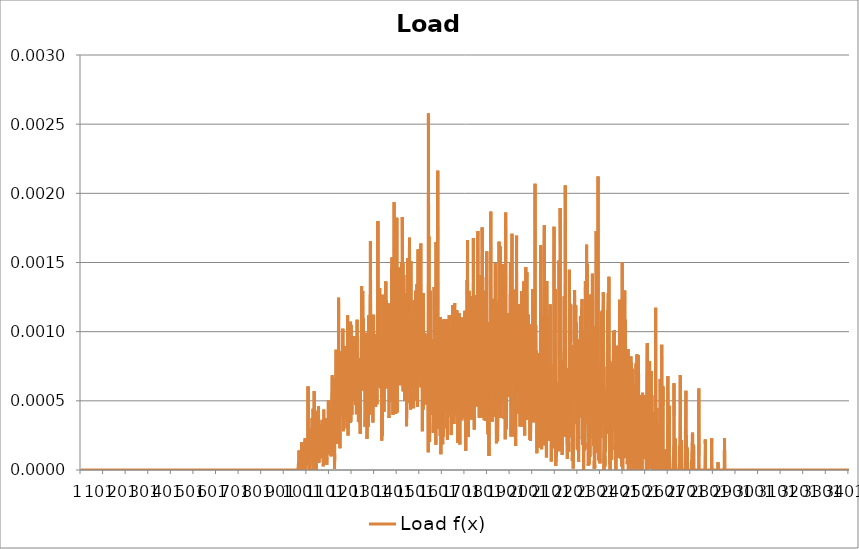
| Category | Load f(x) |
|---|---|
| 0 | 0 |
| 1 | 0 |
| 2 | 0 |
| 3 | 0 |
| 4 | 0 |
| 5 | 0 |
| 6 | 0 |
| 7 | 0 |
| 8 | 0 |
| 9 | 0 |
| 10 | 0 |
| 11 | 0 |
| 12 | 0 |
| 13 | 0 |
| 14 | 0 |
| 15 | 0 |
| 16 | 0 |
| 17 | 0 |
| 18 | 0 |
| 19 | 0 |
| 20 | 0 |
| 21 | 0 |
| 22 | 0 |
| 23 | 0 |
| 24 | 0 |
| 25 | 0 |
| 26 | 0 |
| 27 | 0 |
| 28 | 0 |
| 29 | 0 |
| 30 | 0 |
| 31 | 0 |
| 32 | 0 |
| 33 | 0 |
| 34 | 0 |
| 35 | 0 |
| 36 | 0 |
| 37 | 0 |
| 38 | 0 |
| 39 | 0 |
| 40 | 0 |
| 41 | 0 |
| 42 | 0 |
| 43 | 0 |
| 44 | 0 |
| 45 | 0 |
| 46 | 0 |
| 47 | 0 |
| 48 | 0 |
| 49 | 0 |
| 50 | 0 |
| 51 | 0 |
| 52 | 0 |
| 53 | 0 |
| 54 | 0 |
| 55 | 0 |
| 56 | 0 |
| 57 | 0 |
| 58 | 0 |
| 59 | 0 |
| 60 | 0 |
| 61 | 0 |
| 62 | 0 |
| 63 | 0 |
| 64 | 0 |
| 65 | 0 |
| 66 | 0 |
| 67 | 0 |
| 68 | 0 |
| 69 | 0 |
| 70 | 0 |
| 71 | 0 |
| 72 | 0 |
| 73 | 0 |
| 74 | 0 |
| 75 | 0 |
| 76 | 0 |
| 77 | 0 |
| 78 | 0 |
| 79 | 0 |
| 80 | 0 |
| 81 | 0 |
| 82 | 0 |
| 83 | 0 |
| 84 | 0 |
| 85 | 0 |
| 86 | 0 |
| 87 | 0 |
| 88 | 0 |
| 89 | 0 |
| 90 | 0 |
| 91 | 0 |
| 92 | 0 |
| 93 | 0 |
| 94 | 0 |
| 95 | 0 |
| 96 | 0 |
| 97 | 0 |
| 98 | 0 |
| 99 | 0 |
| 100 | 0 |
| 101 | 0 |
| 102 | 0 |
| 103 | 0 |
| 104 | 0 |
| 105 | 0 |
| 106 | 0 |
| 107 | 0 |
| 108 | 0 |
| 109 | 0 |
| 110 | 0 |
| 111 | 0 |
| 112 | 0 |
| 113 | 0 |
| 114 | 0 |
| 115 | 0 |
| 116 | 0 |
| 117 | 0 |
| 118 | 0 |
| 119 | 0 |
| 120 | 0 |
| 121 | 0 |
| 122 | 0 |
| 123 | 0 |
| 124 | 0 |
| 125 | 0 |
| 126 | 0 |
| 127 | 0 |
| 128 | 0 |
| 129 | 0 |
| 130 | 0 |
| 131 | 0 |
| 132 | 0 |
| 133 | 0 |
| 134 | 0 |
| 135 | 0 |
| 136 | 0 |
| 137 | 0 |
| 138 | 0 |
| 139 | 0 |
| 140 | 0 |
| 141 | 0 |
| 142 | 0 |
| 143 | 0 |
| 144 | 0 |
| 145 | 0 |
| 146 | 0 |
| 147 | 0 |
| 148 | 0 |
| 149 | 0 |
| 150 | 0 |
| 151 | 0 |
| 152 | 0 |
| 153 | 0 |
| 154 | 0 |
| 155 | 0 |
| 156 | 0 |
| 157 | 0 |
| 158 | 0 |
| 159 | 0 |
| 160 | 0 |
| 161 | 0 |
| 162 | 0 |
| 163 | 0 |
| 164 | 0 |
| 165 | 0 |
| 166 | 0 |
| 167 | 0 |
| 168 | 0 |
| 169 | 0 |
| 170 | 0 |
| 171 | 0 |
| 172 | 0 |
| 173 | 0 |
| 174 | 0 |
| 175 | 0 |
| 176 | 0 |
| 177 | 0 |
| 178 | 0 |
| 179 | 0 |
| 180 | 0 |
| 181 | 0 |
| 182 | 0 |
| 183 | 0 |
| 184 | 0 |
| 185 | 0 |
| 186 | 0 |
| 187 | 0 |
| 188 | 0 |
| 189 | 0 |
| 190 | 0 |
| 191 | 0 |
| 192 | 0 |
| 193 | 0 |
| 194 | 0 |
| 195 | 0 |
| 196 | 0 |
| 197 | 0 |
| 198 | 0 |
| 199 | 0 |
| 200 | 0 |
| 201 | 0 |
| 202 | 0 |
| 203 | 0 |
| 204 | 0 |
| 205 | 0 |
| 206 | 0 |
| 207 | 0 |
| 208 | 0 |
| 209 | 0 |
| 210 | 0 |
| 211 | 0 |
| 212 | 0 |
| 213 | 0 |
| 214 | 0 |
| 215 | 0 |
| 216 | 0 |
| 217 | 0 |
| 218 | 0 |
| 219 | 0 |
| 220 | 0 |
| 221 | 0 |
| 222 | 0 |
| 223 | 0 |
| 224 | 0 |
| 225 | 0 |
| 226 | 0 |
| 227 | 0 |
| 228 | 0 |
| 229 | 0 |
| 230 | 0 |
| 231 | 0 |
| 232 | 0 |
| 233 | 0 |
| 234 | 0 |
| 235 | 0 |
| 236 | 0 |
| 237 | 0 |
| 238 | 0 |
| 239 | 0 |
| 240 | 0 |
| 241 | 0 |
| 242 | 0 |
| 243 | 0 |
| 244 | 0 |
| 245 | 0 |
| 246 | 0 |
| 247 | 0 |
| 248 | 0 |
| 249 | 0 |
| 250 | 0 |
| 251 | 0 |
| 252 | 0 |
| 253 | 0 |
| 254 | 0 |
| 255 | 0 |
| 256 | 0 |
| 257 | 0 |
| 258 | 0 |
| 259 | 0 |
| 260 | 0 |
| 261 | 0 |
| 262 | 0 |
| 263 | 0 |
| 264 | 0 |
| 265 | 0 |
| 266 | 0 |
| 267 | 0 |
| 268 | 0 |
| 269 | 0 |
| 270 | 0 |
| 271 | 0 |
| 272 | 0 |
| 273 | 0 |
| 274 | 0 |
| 275 | 0 |
| 276 | 0 |
| 277 | 0 |
| 278 | 0 |
| 279 | 0 |
| 280 | 0 |
| 281 | 0 |
| 282 | 0 |
| 283 | 0 |
| 284 | 0 |
| 285 | 0 |
| 286 | 0 |
| 287 | 0 |
| 288 | 0 |
| 289 | 0 |
| 290 | 0 |
| 291 | 0 |
| 292 | 0 |
| 293 | 0 |
| 294 | 0 |
| 295 | 0 |
| 296 | 0 |
| 297 | 0 |
| 298 | 0 |
| 299 | 0 |
| 300 | 0 |
| 301 | 0 |
| 302 | 0 |
| 303 | 0 |
| 304 | 0 |
| 305 | 0 |
| 306 | 0 |
| 307 | 0 |
| 308 | 0 |
| 309 | 0 |
| 310 | 0 |
| 311 | 0 |
| 312 | 0 |
| 313 | 0 |
| 314 | 0 |
| 315 | 0 |
| 316 | 0 |
| 317 | 0 |
| 318 | 0 |
| 319 | 0 |
| 320 | 0 |
| 321 | 0 |
| 322 | 0 |
| 323 | 0 |
| 324 | 0 |
| 325 | 0 |
| 326 | 0 |
| 327 | 0 |
| 328 | 0 |
| 329 | 0 |
| 330 | 0 |
| 331 | 0 |
| 332 | 0 |
| 333 | 0 |
| 334 | 0 |
| 335 | 0 |
| 336 | 0 |
| 337 | 0 |
| 338 | 0 |
| 339 | 0 |
| 340 | 0 |
| 341 | 0 |
| 342 | 0 |
| 343 | 0 |
| 344 | 0 |
| 345 | 0 |
| 346 | 0 |
| 347 | 0 |
| 348 | 0 |
| 349 | 0 |
| 350 | 0 |
| 351 | 0 |
| 352 | 0 |
| 353 | 0 |
| 354 | 0 |
| 355 | 0 |
| 356 | 0 |
| 357 | 0 |
| 358 | 0 |
| 359 | 0 |
| 360 | 0 |
| 361 | 0 |
| 362 | 0 |
| 363 | 0 |
| 364 | 0 |
| 365 | 0 |
| 366 | 0 |
| 367 | 0 |
| 368 | 0 |
| 369 | 0 |
| 370 | 0 |
| 371 | 0 |
| 372 | 0 |
| 373 | 0 |
| 374 | 0 |
| 375 | 0 |
| 376 | 0 |
| 377 | 0 |
| 378 | 0 |
| 379 | 0 |
| 380 | 0 |
| 381 | 0 |
| 382 | 0 |
| 383 | 0 |
| 384 | 0 |
| 385 | 0 |
| 386 | 0 |
| 387 | 0 |
| 388 | 0 |
| 389 | 0 |
| 390 | 0 |
| 391 | 0 |
| 392 | 0 |
| 393 | 0 |
| 394 | 0 |
| 395 | 0 |
| 396 | 0 |
| 397 | 0 |
| 398 | 0 |
| 399 | 0 |
| 400 | 0 |
| 401 | 0 |
| 402 | 0 |
| 403 | 0 |
| 404 | 0 |
| 405 | 0 |
| 406 | 0 |
| 407 | 0 |
| 408 | 0 |
| 409 | 0 |
| 410 | 0 |
| 411 | 0 |
| 412 | 0 |
| 413 | 0 |
| 414 | 0 |
| 415 | 0 |
| 416 | 0 |
| 417 | 0 |
| 418 | 0 |
| 419 | 0 |
| 420 | 0 |
| 421 | 0 |
| 422 | 0 |
| 423 | 0 |
| 424 | 0 |
| 425 | 0 |
| 426 | 0 |
| 427 | 0 |
| 428 | 0 |
| 429 | 0 |
| 430 | 0 |
| 431 | 0 |
| 432 | 0 |
| 433 | 0 |
| 434 | 0 |
| 435 | 0 |
| 436 | 0 |
| 437 | 0 |
| 438 | 0 |
| 439 | 0 |
| 440 | 0 |
| 441 | 0 |
| 442 | 0 |
| 443 | 0 |
| 444 | 0 |
| 445 | 0 |
| 446 | 0 |
| 447 | 0 |
| 448 | 0 |
| 449 | 0 |
| 450 | 0 |
| 451 | 0 |
| 452 | 0 |
| 453 | 0 |
| 454 | 0 |
| 455 | 0 |
| 456 | 0 |
| 457 | 0 |
| 458 | 0 |
| 459 | 0 |
| 460 | 0 |
| 461 | 0 |
| 462 | 0 |
| 463 | 0 |
| 464 | 0 |
| 465 | 0 |
| 466 | 0 |
| 467 | 0 |
| 468 | 0 |
| 469 | 0 |
| 470 | 0 |
| 471 | 0 |
| 472 | 0 |
| 473 | 0 |
| 474 | 0 |
| 475 | 0 |
| 476 | 0 |
| 477 | 0 |
| 478 | 0 |
| 479 | 0 |
| 480 | 0 |
| 481 | 0 |
| 482 | 0 |
| 483 | 0 |
| 484 | 0 |
| 485 | 0 |
| 486 | 0 |
| 487 | 0 |
| 488 | 0 |
| 489 | 0 |
| 490 | 0 |
| 491 | 0 |
| 492 | 0 |
| 493 | 0 |
| 494 | 0 |
| 495 | 0 |
| 496 | 0 |
| 497 | 0 |
| 498 | 0 |
| 499 | 0 |
| 500 | 0 |
| 501 | 0 |
| 502 | 0 |
| 503 | 0 |
| 504 | 0 |
| 505 | 0 |
| 506 | 0 |
| 507 | 0 |
| 508 | 0 |
| 509 | 0 |
| 510 | 0 |
| 511 | 0 |
| 512 | 0 |
| 513 | 0 |
| 514 | 0 |
| 515 | 0 |
| 516 | 0 |
| 517 | 0 |
| 518 | 0 |
| 519 | 0 |
| 520 | 0 |
| 521 | 0 |
| 522 | 0 |
| 523 | 0 |
| 524 | 0 |
| 525 | 0 |
| 526 | 0 |
| 527 | 0 |
| 528 | 0 |
| 529 | 0 |
| 530 | 0 |
| 531 | 0 |
| 532 | 0 |
| 533 | 0 |
| 534 | 0 |
| 535 | 0 |
| 536 | 0 |
| 537 | 0 |
| 538 | 0 |
| 539 | 0 |
| 540 | 0 |
| 541 | 0 |
| 542 | 0 |
| 543 | 0 |
| 544 | 0 |
| 545 | 0 |
| 546 | 0 |
| 547 | 0 |
| 548 | 0 |
| 549 | 0 |
| 550 | 0 |
| 551 | 0 |
| 552 | 0 |
| 553 | 0 |
| 554 | 0 |
| 555 | 0 |
| 556 | 0 |
| 557 | 0 |
| 558 | 0 |
| 559 | 0 |
| 560 | 0 |
| 561 | 0 |
| 562 | 0 |
| 563 | 0 |
| 564 | 0 |
| 565 | 0 |
| 566 | 0 |
| 567 | 0 |
| 568 | 0 |
| 569 | 0 |
| 570 | 0 |
| 571 | 0 |
| 572 | 0 |
| 573 | 0 |
| 574 | 0 |
| 575 | 0 |
| 576 | 0 |
| 577 | 0 |
| 578 | 0 |
| 579 | 0 |
| 580 | 0 |
| 581 | 0 |
| 582 | 0 |
| 583 | 0 |
| 584 | 0 |
| 585 | 0 |
| 586 | 0 |
| 587 | 0 |
| 588 | 0 |
| 589 | 0 |
| 590 | 0 |
| 591 | 0 |
| 592 | 0 |
| 593 | 0 |
| 594 | 0 |
| 595 | 0 |
| 596 | 0 |
| 597 | 0 |
| 598 | 0 |
| 599 | 0 |
| 600 | 0 |
| 601 | 0 |
| 602 | 0 |
| 603 | 0 |
| 604 | 0 |
| 605 | 0 |
| 606 | 0 |
| 607 | 0 |
| 608 | 0 |
| 609 | 0 |
| 610 | 0 |
| 611 | 0 |
| 612 | 0 |
| 613 | 0 |
| 614 | 0 |
| 615 | 0 |
| 616 | 0 |
| 617 | 0 |
| 618 | 0 |
| 619 | 0 |
| 620 | 0 |
| 621 | 0 |
| 622 | 0 |
| 623 | 0 |
| 624 | 0 |
| 625 | 0 |
| 626 | 0 |
| 627 | 0 |
| 628 | 0 |
| 629 | 0 |
| 630 | 0 |
| 631 | 0 |
| 632 | 0 |
| 633 | 0 |
| 634 | 0 |
| 635 | 0 |
| 636 | 0 |
| 637 | 0 |
| 638 | 0 |
| 639 | 0 |
| 640 | 0 |
| 641 | 0 |
| 642 | 0 |
| 643 | 0 |
| 644 | 0 |
| 645 | 0 |
| 646 | 0 |
| 647 | 0 |
| 648 | 0 |
| 649 | 0 |
| 650 | 0 |
| 651 | 0 |
| 652 | 0 |
| 653 | 0 |
| 654 | 0 |
| 655 | 0 |
| 656 | 0 |
| 657 | 0 |
| 658 | 0 |
| 659 | 0 |
| 660 | 0 |
| 661 | 0 |
| 662 | 0 |
| 663 | 0 |
| 664 | 0 |
| 665 | 0 |
| 666 | 0 |
| 667 | 0 |
| 668 | 0 |
| 669 | 0 |
| 670 | 0 |
| 671 | 0 |
| 672 | 0 |
| 673 | 0 |
| 674 | 0 |
| 675 | 0 |
| 676 | 0 |
| 677 | 0 |
| 678 | 0 |
| 679 | 0 |
| 680 | 0 |
| 681 | 0 |
| 682 | 0 |
| 683 | 0 |
| 684 | 0 |
| 685 | 0 |
| 686 | 0 |
| 687 | 0 |
| 688 | 0 |
| 689 | 0 |
| 690 | 0 |
| 691 | 0 |
| 692 | 0 |
| 693 | 0 |
| 694 | 0 |
| 695 | 0 |
| 696 | 0 |
| 697 | 0 |
| 698 | 0 |
| 699 | 0 |
| 700 | 0 |
| 701 | 0 |
| 702 | 0 |
| 703 | 0 |
| 704 | 0 |
| 705 | 0 |
| 706 | 0 |
| 707 | 0 |
| 708 | 0 |
| 709 | 0 |
| 710 | 0 |
| 711 | 0 |
| 712 | 0 |
| 713 | 0 |
| 714 | 0 |
| 715 | 0 |
| 716 | 0 |
| 717 | 0 |
| 718 | 0 |
| 719 | 0 |
| 720 | 0 |
| 721 | 0 |
| 722 | 0 |
| 723 | 0 |
| 724 | 0 |
| 725 | 0 |
| 726 | 0 |
| 727 | 0 |
| 728 | 0 |
| 729 | 0 |
| 730 | 0 |
| 731 | 0 |
| 732 | 0 |
| 733 | 0 |
| 734 | 0 |
| 735 | 0 |
| 736 | 0 |
| 737 | 0 |
| 738 | 0 |
| 739 | 0 |
| 740 | 0 |
| 741 | 0 |
| 742 | 0 |
| 743 | 0 |
| 744 | 0 |
| 745 | 0 |
| 746 | 0 |
| 747 | 0 |
| 748 | 0 |
| 749 | 0 |
| 750 | 0 |
| 751 | 0 |
| 752 | 0 |
| 753 | 0 |
| 754 | 0 |
| 755 | 0 |
| 756 | 0 |
| 757 | 0 |
| 758 | 0 |
| 759 | 0 |
| 760 | 0 |
| 761 | 0 |
| 762 | 0 |
| 763 | 0 |
| 764 | 0 |
| 765 | 0 |
| 766 | 0 |
| 767 | 0 |
| 768 | 0 |
| 769 | 0 |
| 770 | 0 |
| 771 | 0 |
| 772 | 0 |
| 773 | 0 |
| 774 | 0 |
| 775 | 0 |
| 776 | 0 |
| 777 | 0 |
| 778 | 0 |
| 779 | 0 |
| 780 | 0 |
| 781 | 0 |
| 782 | 0 |
| 783 | 0 |
| 784 | 0 |
| 785 | 0 |
| 786 | 0 |
| 787 | 0 |
| 788 | 0 |
| 789 | 0 |
| 790 | 0 |
| 791 | 0 |
| 792 | 0 |
| 793 | 0 |
| 794 | 0 |
| 795 | 0 |
| 796 | 0 |
| 797 | 0 |
| 798 | 0 |
| 799 | 0 |
| 800 | 0 |
| 801 | 0 |
| 802 | 0 |
| 803 | 0 |
| 804 | 0 |
| 805 | 0 |
| 806 | 0 |
| 807 | 0 |
| 808 | 0 |
| 809 | 0 |
| 810 | 0 |
| 811 | 0 |
| 812 | 0 |
| 813 | 0 |
| 814 | 0 |
| 815 | 0 |
| 816 | 0 |
| 817 | 0 |
| 818 | 0 |
| 819 | 0 |
| 820 | 0 |
| 821 | 0 |
| 822 | 0 |
| 823 | 0 |
| 824 | 0 |
| 825 | 0 |
| 826 | 0 |
| 827 | 0 |
| 828 | 0 |
| 829 | 0 |
| 830 | 0 |
| 831 | 0 |
| 832 | 0 |
| 833 | 0 |
| 834 | 0 |
| 835 | 0 |
| 836 | 0 |
| 837 | 0 |
| 838 | 0 |
| 839 | 0 |
| 840 | 0 |
| 841 | 0 |
| 842 | 0 |
| 843 | 0 |
| 844 | 0 |
| 845 | 0 |
| 846 | 0 |
| 847 | 0 |
| 848 | 0 |
| 849 | 0 |
| 850 | 0 |
| 851 | 0 |
| 852 | 0 |
| 853 | 0 |
| 854 | 0 |
| 855 | 0 |
| 856 | 0 |
| 857 | 0 |
| 858 | 0 |
| 859 | 0 |
| 860 | 0 |
| 861 | 0 |
| 862 | 0 |
| 863 | 0 |
| 864 | 0 |
| 865 | 0 |
| 866 | 0 |
| 867 | 0 |
| 868 | 0 |
| 869 | 0 |
| 870 | 0 |
| 871 | 0 |
| 872 | 0 |
| 873 | 0 |
| 874 | 0 |
| 875 | 0 |
| 876 | 0 |
| 877 | 0 |
| 878 | 0 |
| 879 | 0 |
| 880 | 0 |
| 881 | 0 |
| 882 | 0 |
| 883 | 0 |
| 884 | 0 |
| 885 | 0 |
| 886 | 0 |
| 887 | 0 |
| 888 | 0 |
| 889 | 0 |
| 890 | 0 |
| 891 | 0 |
| 892 | 0 |
| 893 | 0 |
| 894 | 0 |
| 895 | 0 |
| 896 | 0 |
| 897 | 0 |
| 898 | 0 |
| 899 | 0 |
| 900 | 0 |
| 901 | 0 |
| 902 | 0 |
| 903 | 0 |
| 904 | 0 |
| 905 | 0 |
| 906 | 0 |
| 907 | 0 |
| 908 | 0 |
| 909 | 0 |
| 910 | 0 |
| 911 | 0 |
| 912 | 0 |
| 913 | 0 |
| 914 | 0 |
| 915 | 0 |
| 916 | 0 |
| 917 | 0 |
| 918 | 0 |
| 919 | 0 |
| 920 | 0 |
| 921 | 0 |
| 922 | 0 |
| 923 | 0 |
| 924 | 0 |
| 925 | 0 |
| 926 | 0 |
| 927 | 0 |
| 928 | 0 |
| 929 | 0 |
| 930 | 0 |
| 931 | 0 |
| 932 | 0 |
| 933 | 0 |
| 934 | 0 |
| 935 | 0 |
| 936 | 0 |
| 937 | 0 |
| 938 | 0 |
| 939 | 0 |
| 940 | 0 |
| 941 | 0 |
| 942 | 0 |
| 943 | 0 |
| 944 | 0 |
| 945 | 0 |
| 946 | 0 |
| 947 | 0 |
| 948 | 0 |
| 949 | 0 |
| 950 | 0 |
| 951 | 0 |
| 952 | 0 |
| 953 | 0 |
| 954 | 0 |
| 955 | 0 |
| 956 | 0 |
| 957 | 0 |
| 958 | 0 |
| 959 | 0 |
| 960 | 0 |
| 961 | 0 |
| 962 | 0 |
| 963 | 0 |
| 964 | 0 |
| 965 | 0 |
| 966 | 0 |
| 967 | 0 |
| 968 | 0 |
| 969 | 0 |
| 970 | 0 |
| 971 | 0 |
| 972 | 0 |
| 973 | 0 |
| 974 | 0 |
| 975 | 0 |
| 976 | 0 |
| 977 | 0 |
| 978 | 0 |
| 979 | 0 |
| 980 | 0 |
| 981 | 0 |
| 982 | 0 |
| 983 | 0 |
| 984 | 0 |
| 985 | 0 |
| 986 | 0 |
| 987 | 0 |
| 988 | 0 |
| 989 | 0 |
| 990 | 0 |
| 991 | 0 |
| 992 | 0 |
| 993 | 0 |
| 994 | 0 |
| 995 | 0 |
| 996 | 0 |
| 997 | 0 |
| 998 | 0 |
| 999 | 0 |
| 1000 | 0 |
| 1001 | 0 |
| 1002 | 0 |
| 1003 | 0 |
| 1004 | 0 |
| 1005 | 0.001 |
| 1006 | 0 |
| 1007 | 0 |
| 1008 | 0 |
| 1009 | 0 |
| 1010 | 0 |
| 1011 | 0 |
| 1012 | 0 |
| 1013 | 0 |
| 1014 | 0 |
| 1015 | 0 |
| 1016 | 0 |
| 1017 | 0 |
| 1018 | 0 |
| 1019 | 0 |
| 1020 | 0 |
| 1021 | 0 |
| 1022 | 0 |
| 1023 | 0 |
| 1024 | 0 |
| 1025 | 0 |
| 1026 | 0 |
| 1027 | 0 |
| 1028 | 0 |
| 1029 | 0 |
| 1030 | 0 |
| 1031 | 0 |
| 1032 | 0.001 |
| 1033 | 0 |
| 1034 | 0 |
| 1035 | 0 |
| 1036 | 0 |
| 1037 | 0 |
| 1038 | 0 |
| 1039 | 0 |
| 1040 | 0 |
| 1041 | 0 |
| 1042 | 0 |
| 1043 | 0 |
| 1044 | 0 |
| 1045 | 0 |
| 1046 | 0 |
| 1047 | 0 |
| 1048 | 0 |
| 1049 | 0 |
| 1050 | 0 |
| 1051 | 0 |
| 1052 | 0 |
| 1053 | 0 |
| 1054 | 0 |
| 1055 | 0 |
| 1056 | 0 |
| 1057 | 0 |
| 1058 | 0 |
| 1059 | 0 |
| 1060 | 0 |
| 1061 | 0 |
| 1062 | 0 |
| 1063 | 0 |
| 1064 | 0 |
| 1065 | 0 |
| 1066 | 0 |
| 1067 | 0 |
| 1068 | 0 |
| 1069 | 0 |
| 1070 | 0 |
| 1071 | 0 |
| 1072 | 0 |
| 1073 | 0 |
| 1074 | 0 |
| 1075 | 0 |
| 1076 | 0 |
| 1077 | 0 |
| 1078 | 0 |
| 1079 | 0 |
| 1080 | 0 |
| 1081 | 0 |
| 1082 | 0 |
| 1083 | 0 |
| 1084 | 0 |
| 1085 | 0 |
| 1086 | 0 |
| 1087 | 0 |
| 1088 | 0 |
| 1089 | 0 |
| 1090 | 0 |
| 1091 | 0 |
| 1092 | 0 |
| 1093 | 0 |
| 1094 | 0 |
| 1095 | 0.001 |
| 1096 | 0 |
| 1097 | 0 |
| 1098 | 0 |
| 1099 | 0 |
| 1100 | 0 |
| 1101 | 0 |
| 1102 | 0 |
| 1103 | 0 |
| 1104 | 0 |
| 1105 | 0 |
| 1106 | 0 |
| 1107 | 0 |
| 1108 | 0 |
| 1109 | 0 |
| 1110 | 0.001 |
| 1111 | 0.001 |
| 1112 | 0.001 |
| 1113 | 0 |
| 1114 | 0 |
| 1115 | 0 |
| 1116 | 0 |
| 1117 | 0 |
| 1118 | 0 |
| 1119 | 0 |
| 1120 | 0 |
| 1121 | 0 |
| 1122 | 0 |
| 1123 | 0 |
| 1124 | 0.001 |
| 1125 | 0 |
| 1126 | 0 |
| 1127 | 0.001 |
| 1128 | 0.001 |
| 1129 | 0.001 |
| 1130 | 0 |
| 1131 | 0 |
| 1132 | 0.001 |
| 1133 | 0 |
| 1134 | 0 |
| 1135 | 0 |
| 1136 | 0.001 |
| 1137 | 0 |
| 1138 | 0 |
| 1139 | 0 |
| 1140 | 0.001 |
| 1141 | 0.001 |
| 1142 | 0 |
| 1143 | 0.001 |
| 1144 | 0.001 |
| 1145 | 0 |
| 1146 | 0 |
| 1147 | 0 |
| 1148 | 0.001 |
| 1149 | 0.001 |
| 1150 | 0 |
| 1151 | 0 |
| 1152 | 0.001 |
| 1153 | 0 |
| 1154 | 0 |
| 1155 | 0.001 |
| 1156 | 0.001 |
| 1157 | 0.001 |
| 1158 | 0.001 |
| 1159 | 0.001 |
| 1160 | 0.001 |
| 1161 | 0 |
| 1162 | 0.001 |
| 1163 | 0.001 |
| 1164 | 0.001 |
| 1165 | 0.001 |
| 1166 | 0 |
| 1167 | 0.001 |
| 1168 | 0.001 |
| 1169 | 0 |
| 1170 | 0.001 |
| 1171 | 0.001 |
| 1172 | 0.001 |
| 1173 | 0.001 |
| 1174 | 0.001 |
| 1175 | 0.001 |
| 1176 | 0.001 |
| 1177 | 0 |
| 1178 | 0.001 |
| 1179 | 0.001 |
| 1180 | 0.001 |
| 1181 | 0.001 |
| 1182 | 0 |
| 1183 | 0 |
| 1184 | 0 |
| 1185 | 0.001 |
| 1186 | 0.001 |
| 1187 | 0.001 |
| 1188 | 0.001 |
| 1189 | 0.001 |
| 1190 | 0 |
| 1191 | 0.001 |
| 1192 | 0.001 |
| 1193 | 0.001 |
| 1194 | 0 |
| 1195 | 0.001 |
| 1196 | 0.001 |
| 1197 | 0.001 |
| 1198 | 0.001 |
| 1199 | 0 |
| 1200 | 0.001 |
| 1201 | 0.001 |
| 1202 | 0.001 |
| 1203 | 0.001 |
| 1204 | 0.001 |
| 1205 | 0.001 |
| 1206 | 0.001 |
| 1207 | 0.001 |
| 1208 | 0.001 |
| 1209 | 0.001 |
| 1210 | 0.001 |
| 1211 | 0.001 |
| 1212 | 0.001 |
| 1213 | 0.001 |
| 1214 | 0.001 |
| 1215 | 0 |
| 1216 | 0.001 |
| 1217 | 0.001 |
| 1218 | 0.001 |
| 1219 | 0 |
| 1220 | 0.001 |
| 1221 | 0.001 |
| 1222 | 0.001 |
| 1223 | 0.001 |
| 1224 | 0.001 |
| 1225 | 0.001 |
| 1226 | 0.001 |
| 1227 | 0.001 |
| 1228 | 0 |
| 1229 | 0.001 |
| 1230 | 0.001 |
| 1231 | 0.001 |
| 1232 | 0.001 |
| 1233 | 0 |
| 1234 | 0 |
| 1235 | 0.001 |
| 1236 | 0 |
| 1237 | 0.001 |
| 1238 | 0.001 |
| 1239 | 0.001 |
| 1240 | 0.001 |
| 1241 | 0.001 |
| 1242 | 0.001 |
| 1243 | 0.001 |
| 1244 | 0.001 |
| 1245 | 0.001 |
| 1246 | 0.001 |
| 1247 | 0.001 |
| 1248 | 0.001 |
| 1249 | 0.001 |
| 1250 | 0.001 |
| 1251 | 0.001 |
| 1252 | 0.001 |
| 1253 | 0.001 |
| 1254 | 0.001 |
| 1255 | 0.001 |
| 1256 | 0.001 |
| 1257 | 0 |
| 1258 | 0 |
| 1259 | 0.001 |
| 1260 | 0.001 |
| 1261 | 0 |
| 1262 | 0.001 |
| 1263 | 0.001 |
| 1264 | 0.001 |
| 1265 | 0.001 |
| 1266 | 0 |
| 1267 | 0.001 |
| 1268 | 0.001 |
| 1269 | 0.001 |
| 1270 | 0.001 |
| 1271 | 0.001 |
| 1272 | 0 |
| 1273 | 0.001 |
| 1274 | 0.001 |
| 1275 | 0.001 |
| 1276 | 0 |
| 1277 | 0.001 |
| 1278 | 0.001 |
| 1279 | 0.001 |
| 1280 | 0.001 |
| 1281 | 0.002 |
| 1282 | 0.001 |
| 1283 | 0.001 |
| 1284 | 0.001 |
| 1285 | 0.001 |
| 1286 | 0.001 |
| 1287 | 0.001 |
| 1288 | 0.001 |
| 1289 | 0 |
| 1290 | 0.001 |
| 1291 | 0.001 |
| 1292 | 0 |
| 1293 | 0.001 |
| 1294 | 0.001 |
| 1295 | 0.001 |
| 1296 | 0.001 |
| 1297 | 0.001 |
| 1298 | 0.001 |
| 1299 | 0.001 |
| 1300 | 0.001 |
| 1301 | 0.001 |
| 1302 | 0.001 |
| 1303 | 0.001 |
| 1304 | 0 |
| 1305 | 0.001 |
| 1306 | 0.001 |
| 1307 | 0 |
| 1308 | 0.001 |
| 1309 | 0.001 |
| 1310 | 0 |
| 1311 | 0.001 |
| 1312 | 0.001 |
| 1313 | 0.001 |
| 1314 | 0.002 |
| 1315 | 0.001 |
| 1316 | 0.001 |
| 1317 | 0.001 |
| 1318 | 0.001 |
| 1319 | 0.001 |
| 1320 | 0.001 |
| 1321 | 0.001 |
| 1322 | 0.001 |
| 1323 | 0.001 |
| 1324 | 0.001 |
| 1325 | 0.001 |
| 1326 | 0.001 |
| 1327 | 0.001 |
| 1328 | 0.001 |
| 1329 | 0.001 |
| 1330 | 0.001 |
| 1331 | 0 |
| 1332 | 0 |
| 1333 | 0.001 |
| 1334 | 0 |
| 1335 | 0.001 |
| 1336 | 0.001 |
| 1337 | 0.001 |
| 1338 | 0.001 |
| 1339 | 0.001 |
| 1340 | 0.001 |
| 1341 | 0 |
| 1342 | 0.001 |
| 1343 | 0.001 |
| 1344 | 0.001 |
| 1345 | 0.001 |
| 1346 | 0.001 |
| 1347 | 0.001 |
| 1348 | 0.001 |
| 1349 | 0.001 |
| 1350 | 0.001 |
| 1351 | 0.001 |
| 1352 | 0.001 |
| 1353 | 0.001 |
| 1354 | 0.001 |
| 1355 | 0.001 |
| 1356 | 0.001 |
| 1357 | 0.001 |
| 1358 | 0.001 |
| 1359 | 0.001 |
| 1360 | 0.001 |
| 1361 | 0.001 |
| 1362 | 0.001 |
| 1363 | 0 |
| 1364 | 0 |
| 1365 | 0.001 |
| 1366 | 0.001 |
| 1367 | 0.001 |
| 1368 | 0.001 |
| 1369 | 0.001 |
| 1370 | 0.001 |
| 1371 | 0 |
| 1372 | 0.001 |
| 1373 | 0.001 |
| 1374 | 0.001 |
| 1375 | 0.001 |
| 1376 | 0.001 |
| 1377 | 0.002 |
| 1378 | 0.001 |
| 1379 | 0.001 |
| 1380 | 0.001 |
| 1381 | 0 |
| 1382 | 0.001 |
| 1383 | 0.001 |
| 1384 | 0.001 |
| 1385 | 0.001 |
| 1386 | 0.002 |
| 1387 | 0.001 |
| 1388 | 0.001 |
| 1389 | 0.001 |
| 1390 | 0.001 |
| 1391 | 0.002 |
| 1392 | 0.002 |
| 1393 | 0 |
| 1394 | 0.001 |
| 1395 | 0.001 |
| 1396 | 0.001 |
| 1397 | 0.001 |
| 1398 | 0.002 |
| 1399 | 0 |
| 1400 | 0 |
| 1401 | 0.001 |
| 1402 | 0.001 |
| 1403 | 0.001 |
| 1404 | 0.001 |
| 1405 | 0.001 |
| 1406 | 0.001 |
| 1407 | 0.001 |
| 1408 | 0.001 |
| 1409 | 0.001 |
| 1410 | 0.001 |
| 1411 | 0.001 |
| 1412 | 0.001 |
| 1413 | 0.001 |
| 1414 | 0.001 |
| 1415 | 0.001 |
| 1416 | 0.001 |
| 1417 | 0.001 |
| 1418 | 0.001 |
| 1419 | 0.002 |
| 1420 | 0.001 |
| 1421 | 0.001 |
| 1422 | 0.002 |
| 1423 | 0.002 |
| 1424 | 0.001 |
| 1425 | 0.001 |
| 1426 | 0.001 |
| 1427 | 0.001 |
| 1428 | 0.001 |
| 1429 | 0.001 |
| 1430 | 0.001 |
| 1431 | 0.001 |
| 1432 | 0.001 |
| 1433 | 0.001 |
| 1434 | 0.001 |
| 1435 | 0.001 |
| 1436 | 0.001 |
| 1437 | 0.001 |
| 1438 | 0.001 |
| 1439 | 0.001 |
| 1440 | 0.001 |
| 1441 | 0 |
| 1442 | 0 |
| 1443 | 0.001 |
| 1444 | 0.001 |
| 1445 | 0.001 |
| 1446 | 0.002 |
| 1447 | 0.001 |
| 1448 | 0.001 |
| 1449 | 0.001 |
| 1450 | 0.001 |
| 1451 | 0.001 |
| 1452 | 0.001 |
| 1453 | 0.001 |
| 1454 | 0.002 |
| 1455 | 0.001 |
| 1456 | 0 |
| 1457 | 0.001 |
| 1458 | 0 |
| 1459 | 0 |
| 1460 | 0.002 |
| 1461 | 0.001 |
| 1462 | 0 |
| 1463 | 0.001 |
| 1464 | 0.001 |
| 1465 | 0.001 |
| 1466 | 0.001 |
| 1467 | 0.001 |
| 1468 | 0.001 |
| 1469 | 0.001 |
| 1470 | 0.001 |
| 1471 | 0.001 |
| 1472 | 0 |
| 1473 | 0.001 |
| 1474 | 0.001 |
| 1475 | 0.001 |
| 1476 | 0.001 |
| 1477 | 0.001 |
| 1478 | 0.001 |
| 1479 | 0.001 |
| 1480 | 0.001 |
| 1481 | 0.001 |
| 1482 | 0.001 |
| 1483 | 0.001 |
| 1484 | 0.001 |
| 1485 | 0.001 |
| 1486 | 0.001 |
| 1487 | 0.001 |
| 1488 | 0.001 |
| 1489 | 0 |
| 1490 | 0 |
| 1491 | 0.001 |
| 1492 | 0.002 |
| 1493 | 0.001 |
| 1494 | 0.001 |
| 1495 | 0.001 |
| 1496 | 0.001 |
| 1497 | 0.001 |
| 1498 | 0.001 |
| 1499 | 0.001 |
| 1500 | 0.001 |
| 1501 | 0.001 |
| 1502 | 0.001 |
| 1503 | 0.001 |
| 1504 | 0.002 |
| 1505 | 0.001 |
| 1506 | 0.001 |
| 1507 | 0.001 |
| 1508 | 0.001 |
| 1509 | 0.001 |
| 1510 | 0.001 |
| 1511 | 0 |
| 1512 | 0.001 |
| 1513 | 0.001 |
| 1514 | 0 |
| 1515 | 0.001 |
| 1516 | 0.001 |
| 1517 | 0.001 |
| 1518 | 0 |
| 1519 | 0.001 |
| 1520 | 0.001 |
| 1521 | 0.001 |
| 1522 | 0.001 |
| 1523 | 0.001 |
| 1524 | 0.001 |
| 1525 | 0.001 |
| 1526 | 0.001 |
| 1527 | 0 |
| 1528 | 0 |
| 1529 | 0.001 |
| 1530 | 0.001 |
| 1531 | 0.001 |
| 1532 | 0.001 |
| 1533 | 0.001 |
| 1534 | 0.001 |
| 1535 | 0.001 |
| 1536 | 0.001 |
| 1537 | 0 |
| 1538 | 0.003 |
| 1539 | 0.001 |
| 1540 | 0.002 |
| 1541 | 0 |
| 1542 | 0.001 |
| 1543 | 0 |
| 1544 | 0.001 |
| 1545 | 0 |
| 1546 | 0.001 |
| 1547 | 0.001 |
| 1548 | 0.001 |
| 1549 | 0 |
| 1550 | 0.001 |
| 1551 | 0.001 |
| 1552 | 0 |
| 1553 | 0 |
| 1554 | 0.001 |
| 1555 | 0.001 |
| 1556 | 0.001 |
| 1557 | 0.001 |
| 1558 | 0.001 |
| 1559 | 0 |
| 1560 | 0 |
| 1561 | 0 |
| 1562 | 0.001 |
| 1563 | 0.001 |
| 1564 | 0.001 |
| 1565 | 0.001 |
| 1566 | 0.001 |
| 1567 | 0 |
| 1568 | 0.001 |
| 1569 | 0 |
| 1570 | 0 |
| 1571 | 0 |
| 1572 | 0.002 |
| 1573 | 0.001 |
| 1574 | 0.001 |
| 1575 | 0.001 |
| 1576 | 0 |
| 1577 | 0.001 |
| 1578 | 0 |
| 1579 | 0.002 |
| 1580 | 0.001 |
| 1581 | 0.001 |
| 1582 | 0 |
| 1583 | 0.001 |
| 1584 | 0.001 |
| 1585 | 0 |
| 1586 | 0.001 |
| 1587 | 0.001 |
| 1588 | 0.001 |
| 1589 | 0.001 |
| 1590 | 0 |
| 1591 | 0.001 |
| 1592 | 0.001 |
| 1593 | 0 |
| 1594 | 0.001 |
| 1595 | 0.001 |
| 1596 | 0 |
| 1597 | 0.001 |
| 1598 | 0.001 |
| 1599 | 0.001 |
| 1600 | 0.001 |
| 1601 | 0 |
| 1602 | 0.001 |
| 1603 | 0 |
| 1604 | 0.001 |
| 1605 | 0.001 |
| 1606 | 0.001 |
| 1607 | 0.001 |
| 1608 | 0.001 |
| 1609 | 0.001 |
| 1610 | 0.001 |
| 1611 | 0 |
| 1612 | 0.001 |
| 1613 | 0.001 |
| 1614 | 0.001 |
| 1615 | 0.001 |
| 1616 | 0.001 |
| 1617 | 0.001 |
| 1618 | 0 |
| 1619 | 0.001 |
| 1620 | 0 |
| 1621 | 0.001 |
| 1622 | 0 |
| 1623 | 0.001 |
| 1624 | 0 |
| 1625 | 0 |
| 1626 | 0.001 |
| 1627 | 0.001 |
| 1628 | 0 |
| 1629 | 0.001 |
| 1630 | 0.001 |
| 1631 | 0.001 |
| 1632 | 0 |
| 1633 | 0 |
| 1634 | 0.001 |
| 1635 | 0.001 |
| 1636 | 0.001 |
| 1637 | 0.001 |
| 1638 | 0 |
| 1639 | 0 |
| 1640 | 0.001 |
| 1641 | 0.001 |
| 1642 | 0.001 |
| 1643 | 0.001 |
| 1644 | 0 |
| 1645 | 0.001 |
| 1646 | 0.001 |
| 1647 | 0.001 |
| 1648 | 0 |
| 1649 | 0.001 |
| 1650 | 0.001 |
| 1651 | 0 |
| 1652 | 0 |
| 1653 | 0.001 |
| 1654 | 0.001 |
| 1655 | 0 |
| 1656 | 0.001 |
| 1657 | 0.001 |
| 1658 | 0.001 |
| 1659 | 0.001 |
| 1660 | 0.001 |
| 1661 | 0.001 |
| 1662 | 0 |
| 1663 | 0.001 |
| 1664 | 0.001 |
| 1665 | 0.001 |
| 1666 | 0.001 |
| 1667 | 0.001 |
| 1668 | 0 |
| 1669 | 0 |
| 1670 | 0.001 |
| 1671 | 0.001 |
| 1672 | 0 |
| 1673 | 0.001 |
| 1674 | 0.001 |
| 1675 | 0.001 |
| 1676 | 0.001 |
| 1677 | 0 |
| 1678 | 0.001 |
| 1679 | 0.001 |
| 1680 | 0 |
| 1681 | 0.001 |
| 1682 | 0 |
| 1683 | 0.001 |
| 1684 | 0 |
| 1685 | 0 |
| 1686 | 0 |
| 1687 | 0.001 |
| 1688 | 0.001 |
| 1689 | 0.001 |
| 1690 | 0.001 |
| 1691 | 0.001 |
| 1692 | 0.001 |
| 1693 | 0 |
| 1694 | 0.001 |
| 1695 | 0.001 |
| 1696 | 0.001 |
| 1697 | 0.001 |
| 1698 | 0.001 |
| 1699 | 0.001 |
| 1700 | 0.001 |
| 1701 | 0.001 |
| 1702 | 0.001 |
| 1703 | 0 |
| 1704 | 0 |
| 1705 | 0 |
| 1706 | 0.001 |
| 1707 | 0.001 |
| 1708 | 0.001 |
| 1709 | 0.001 |
| 1710 | 0.001 |
| 1711 | 0.002 |
| 1712 | 0.001 |
| 1713 | 0.001 |
| 1714 | 0 |
| 1715 | 0 |
| 1716 | 0.001 |
| 1717 | 0.001 |
| 1718 | 0.001 |
| 1719 | 0.001 |
| 1720 | 0.001 |
| 1721 | 0.001 |
| 1722 | 0.001 |
| 1723 | 0.001 |
| 1724 | 0 |
| 1725 | 0.001 |
| 1726 | 0.001 |
| 1727 | 0.001 |
| 1728 | 0 |
| 1729 | 0.001 |
| 1730 | 0.001 |
| 1731 | 0.001 |
| 1732 | 0.001 |
| 1733 | 0.001 |
| 1734 | 0.001 |
| 1735 | 0.001 |
| 1736 | 0 |
| 1737 | 0.002 |
| 1738 | 0.001 |
| 1739 | 0.001 |
| 1740 | 0.001 |
| 1741 | 0 |
| 1742 | 0.001 |
| 1743 | 0.001 |
| 1744 | 0.001 |
| 1745 | 0.001 |
| 1746 | 0.001 |
| 1747 | 0.001 |
| 1748 | 0.001 |
| 1749 | 0.001 |
| 1750 | 0.001 |
| 1751 | 0 |
| 1752 | 0.001 |
| 1753 | 0.001 |
| 1754 | 0.001 |
| 1755 | 0.001 |
| 1756 | 0.002 |
| 1757 | 0.002 |
| 1758 | 0.001 |
| 1759 | 0.001 |
| 1760 | 0.001 |
| 1761 | 0.001 |
| 1762 | 0 |
| 1763 | 0 |
| 1764 | 0.001 |
| 1765 | 0.001 |
| 1766 | 0.001 |
| 1767 | 0.001 |
| 1768 | 0.001 |
| 1769 | 0.001 |
| 1770 | 0.001 |
| 1771 | 0.001 |
| 1772 | 0.001 |
| 1773 | 0 |
| 1774 | 0.001 |
| 1775 | 0.001 |
| 1776 | 0.002 |
| 1777 | 0.001 |
| 1778 | 0.001 |
| 1779 | 0.001 |
| 1780 | 0.001 |
| 1781 | 0.001 |
| 1782 | 0.001 |
| 1783 | 0.001 |
| 1784 | 0.001 |
| 1785 | 0 |
| 1786 | 0.001 |
| 1787 | 0.001 |
| 1788 | 0.001 |
| 1789 | 0.001 |
| 1790 | 0.001 |
| 1791 | 0.001 |
| 1792 | 0 |
| 1793 | 0.001 |
| 1794 | 0.001 |
| 1795 | 0.001 |
| 1796 | 0.002 |
| 1797 | 0.001 |
| 1798 | 0.001 |
| 1799 | 0 |
| 1800 | 0 |
| 1801 | 0.001 |
| 1802 | 0 |
| 1803 | 0.001 |
| 1804 | 0.001 |
| 1805 | 0.001 |
| 1806 | 0 |
| 1807 | 0.001 |
| 1808 | 0.001 |
| 1809 | 0.001 |
| 1810 | 0.001 |
| 1811 | 0.001 |
| 1812 | 0.001 |
| 1813 | 0.001 |
| 1814 | 0.002 |
| 1815 | 0.001 |
| 1816 | 0.001 |
| 1817 | 0.001 |
| 1818 | 0.001 |
| 1819 | 0.001 |
| 1820 | 0 |
| 1821 | 0.001 |
| 1822 | 0.001 |
| 1823 | 0.001 |
| 1824 | 0.001 |
| 1825 | 0.001 |
| 1826 | 0.001 |
| 1827 | 0.001 |
| 1828 | 0.001 |
| 1829 | 0.001 |
| 1830 | 0.001 |
| 1831 | 0.001 |
| 1832 | 0.001 |
| 1833 | 0.001 |
| 1834 | 0.001 |
| 1835 | 0 |
| 1836 | 0.001 |
| 1837 | 0.001 |
| 1838 | 0.001 |
| 1839 | 0 |
| 1840 | 0 |
| 1841 | 0.001 |
| 1842 | 0.001 |
| 1843 | 0 |
| 1844 | 0 |
| 1845 | 0 |
| 1846 | 0.001 |
| 1847 | 0.001 |
| 1848 | 0.001 |
| 1849 | 0.001 |
| 1850 | 0.001 |
| 1851 | 0.002 |
| 1852 | 0.001 |
| 1853 | 0 |
| 1854 | 0.001 |
| 1855 | 0.001 |
| 1856 | 0.002 |
| 1857 | 0.001 |
| 1858 | 0 |
| 1859 | 0.001 |
| 1860 | 0.001 |
| 1861 | 0.001 |
| 1862 | 0.001 |
| 1863 | 0 |
| 1864 | 0.001 |
| 1865 | 0.001 |
| 1866 | 0.001 |
| 1867 | 0.001 |
| 1868 | 0.001 |
| 1869 | 0.001 |
| 1870 | 0.001 |
| 1871 | 0.001 |
| 1872 | 0.001 |
| 1873 | 0 |
| 1874 | 0.001 |
| 1875 | 0.001 |
| 1876 | 0.001 |
| 1877 | 0.001 |
| 1878 | 0 |
| 1879 | 0.001 |
| 1880 | 0.002 |
| 1881 | 0.001 |
| 1882 | 0.001 |
| 1883 | 0 |
| 1884 | 0 |
| 1885 | 0.001 |
| 1886 | 0.001 |
| 1887 | 0.001 |
| 1888 | 0.001 |
| 1889 | 0.001 |
| 1890 | 0.001 |
| 1891 | 0.001 |
| 1892 | 0.001 |
| 1893 | 0.001 |
| 1894 | 0.001 |
| 1895 | 0.001 |
| 1896 | 0.001 |
| 1897 | 0.001 |
| 1898 | 0.001 |
| 1899 | 0.001 |
| 1900 | 0.001 |
| 1901 | 0.002 |
| 1902 | 0.001 |
| 1903 | 0 |
| 1904 | 0 |
| 1905 | 0.001 |
| 1906 | 0.001 |
| 1907 | 0.002 |
| 1908 | 0.002 |
| 1909 | 0.001 |
| 1910 | 0.001 |
| 1911 | 0.001 |
| 1912 | 0.001 |
| 1913 | 0.001 |
| 1914 | 0.001 |
| 1915 | 0.001 |
| 1916 | 0.001 |
| 1917 | 0 |
| 1918 | 0.001 |
| 1919 | 0.001 |
| 1920 | 0.001 |
| 1921 | 0.001 |
| 1922 | 0.001 |
| 1923 | 0.001 |
| 1924 | 0 |
| 1925 | 0.001 |
| 1926 | 0.001 |
| 1927 | 0.001 |
| 1928 | 0.002 |
| 1929 | 0.001 |
| 1930 | 0.001 |
| 1931 | 0.001 |
| 1932 | 0.001 |
| 1933 | 0.001 |
| 1934 | 0 |
| 1935 | 0.001 |
| 1936 | 0.001 |
| 1937 | 0.001 |
| 1938 | 0 |
| 1939 | 0.001 |
| 1940 | 0.001 |
| 1941 | 0.001 |
| 1942 | 0.001 |
| 1943 | 0 |
| 1944 | 0 |
| 1945 | 0.001 |
| 1946 | 0.001 |
| 1947 | 0 |
| 1948 | 0.001 |
| 1949 | 0.001 |
| 1950 | 0.001 |
| 1951 | 0 |
| 1952 | 0.001 |
| 1953 | 0.001 |
| 1954 | 0.001 |
| 1955 | 0.001 |
| 1956 | 0 |
| 1957 | 0 |
| 1958 | 0 |
| 1959 | 0 |
| 1960 | 0.001 |
| 1961 | 0.001 |
| 1962 | 0 |
| 1963 | 0 |
| 1964 | 0 |
| 1965 | 0.001 |
| 1966 | 0.001 |
| 1967 | 0.001 |
| 1968 | 0.001 |
| 1969 | 0.001 |
| 1970 | 0.001 |
| 1971 | 0.001 |
| 1972 | 0.001 |
| 1973 | 0.001 |
| 1974 | 0.001 |
| 1975 | 0.001 |
| 1976 | 0.001 |
| 1977 | 0 |
| 1978 | 0 |
| 1979 | 0.001 |
| 1980 | 0.001 |
| 1981 | 0 |
| 1982 | 0.001 |
| 1983 | 0 |
| 1984 | 0.001 |
| 1985 | 0.001 |
| 1986 | 0 |
| 1987 | 0 |
| 1988 | 0.001 |
| 1989 | 0.001 |
| 1990 | 0 |
| 1991 | 0 |
| 1992 | 0.001 |
| 1993 | 0.001 |
| 1994 | 0.001 |
| 1995 | 0.001 |
| 1996 | 0.001 |
| 1997 | 0 |
| 1998 | 0.001 |
| 1999 | 0 |
| 2000 | 0.001 |
| 2001 | 0.001 |
| 2002 | 0 |
| 2003 | 0.001 |
| 2004 | 0 |
| 2005 | 0.001 |
| 2006 | 0.001 |
| 2007 | 0 |
| 2008 | 0 |
| 2009 | 0 |
| 2010 | 0.002 |
| 2011 | 0 |
| 2012 | 0 |
| 2013 | 0.001 |
| 2014 | 0.001 |
| 2015 | 0.001 |
| 2016 | 0.001 |
| 2017 | 0 |
| 2018 | 0 |
| 2019 | 0 |
| 2020 | 0 |
| 2021 | 0.001 |
| 2022 | 0.001 |
| 2023 | 0 |
| 2024 | 0 |
| 2025 | 0 |
| 2026 | 0 |
| 2027 | 0.001 |
| 2028 | 0.001 |
| 2029 | 0.001 |
| 2030 | 0 |
| 2031 | 0 |
| 2032 | 0.001 |
| 2033 | 0.001 |
| 2034 | 0.001 |
| 2035 | 0.002 |
| 2036 | 0.001 |
| 2037 | 0.001 |
| 2038 | 0.001 |
| 2039 | 0 |
| 2040 | 0 |
| 2041 | 0.001 |
| 2042 | 0.001 |
| 2043 | 0 |
| 2044 | 0.001 |
| 2045 | 0.001 |
| 2046 | 0 |
| 2047 | 0 |
| 2048 | 0 |
| 2049 | 0 |
| 2050 | 0.002 |
| 2051 | 0.002 |
| 2052 | 0 |
| 2053 | 0 |
| 2054 | 0.001 |
| 2055 | 0.001 |
| 2056 | 0.001 |
| 2057 | 0.001 |
| 2058 | 0 |
| 2059 | 0 |
| 2060 | 0 |
| 2061 | 0 |
| 2062 | 0.001 |
| 2063 | 0.001 |
| 2064 | 0 |
| 2065 | 0.001 |
| 2066 | 0.001 |
| 2067 | 0 |
| 2068 | 0 |
| 2069 | 0 |
| 2070 | 0 |
| 2071 | 0 |
| 2072 | 0.001 |
| 2073 | 0 |
| 2074 | 0 |
| 2075 | 0.001 |
| 2076 | 0 |
| 2077 | 0.001 |
| 2078 | 0.001 |
| 2079 | 0.001 |
| 2080 | 0.001 |
| 2081 | 0 |
| 2082 | 0 |
| 2083 | 0 |
| 2084 | 0.001 |
| 2085 | 0 |
| 2086 | 0 |
| 2087 | 0.001 |
| 2088 | 0 |
| 2089 | 0 |
| 2090 | 0 |
| 2091 | 0 |
| 2092 | 0 |
| 2093 | 0.001 |
| 2094 | 0.002 |
| 2095 | 0 |
| 2096 | 0.001 |
| 2097 | 0.001 |
| 2098 | 0.001 |
| 2099 | 0.001 |
| 2100 | 0.001 |
| 2101 | 0.001 |
| 2102 | 0 |
| 2103 | 0 |
| 2104 | 0 |
| 2105 | 0 |
| 2106 | 0.001 |
| 2107 | 0 |
| 2108 | 0.001 |
| 2109 | 0 |
| 2110 | 0 |
| 2111 | 0 |
| 2112 | 0 |
| 2113 | 0 |
| 2114 | 0 |
| 2115 | 0.001 |
| 2116 | 0.002 |
| 2117 | 0.001 |
| 2118 | 0 |
| 2119 | 0.001 |
| 2120 | 0.001 |
| 2121 | 0.002 |
| 2122 | 0.002 |
| 2123 | 0 |
| 2124 | 0 |
| 2125 | 0 |
| 2126 | 0 |
| 2127 | 0 |
| 2128 | 0 |
| 2129 | 0.001 |
| 2130 | 0 |
| 2131 | 0 |
| 2132 | 0 |
| 2133 | 0.001 |
| 2134 | 0 |
| 2135 | 0 |
| 2136 | 0 |
| 2137 | 0.001 |
| 2138 | 0.001 |
| 2139 | 0.001 |
| 2140 | 0 |
| 2141 | 0 |
| 2142 | 0.001 |
| 2143 | 0 |
| 2144 | 0.002 |
| 2145 | 0.001 |
| 2146 | 0 |
| 2147 | 0 |
| 2148 | 0 |
| 2149 | 0 |
| 2150 | 0.001 |
| 2151 | 0.001 |
| 2152 | 0 |
| 2153 | 0 |
| 2154 | 0 |
| 2155 | 0 |
| 2156 | 0.001 |
| 2157 | 0 |
| 2158 | 0 |
| 2159 | 0 |
| 2160 | 0 |
| 2161 | 0.001 |
| 2162 | 0.001 |
| 2163 | 0 |
| 2164 | 0 |
| 2165 | 0.001 |
| 2166 | 0.001 |
| 2167 | 0.001 |
| 2168 | 0.001 |
| 2169 | 0.001 |
| 2170 | 0 |
| 2171 | 0 |
| 2172 | 0 |
| 2173 | 0 |
| 2174 | 0 |
| 2175 | 0 |
| 2176 | 0 |
| 2177 | 0.001 |
| 2178 | 0 |
| 2179 | 0 |
| 2180 | 0 |
| 2181 | 0.001 |
| 2182 | 0 |
| 2183 | 0 |
| 2184 | 0.001 |
| 2185 | 0.001 |
| 2186 | 0 |
| 2187 | 0.001 |
| 2188 | 0.001 |
| 2189 | 0.001 |
| 2190 | 0.001 |
| 2191 | 0.001 |
| 2192 | 0.001 |
| 2193 | 0.001 |
| 2194 | 0.001 |
| 2195 | 0 |
| 2196 | 0 |
| 2197 | 0 |
| 2198 | 0 |
| 2199 | 0 |
| 2200 | 0 |
| 2201 | 0 |
| 2202 | 0 |
| 2203 | 0 |
| 2204 | 0.001 |
| 2205 | 0 |
| 2206 | 0 |
| 2207 | 0.001 |
| 2208 | 0.001 |
| 2209 | 0.001 |
| 2210 | 0.001 |
| 2211 | 0.001 |
| 2212 | 0.001 |
| 2213 | 0.001 |
| 2214 | 0.001 |
| 2215 | 0.001 |
| 2216 | 0.001 |
| 2217 | 0.001 |
| 2218 | 0.001 |
| 2219 | 0 |
| 2220 | 0 |
| 2221 | 0 |
| 2222 | 0 |
| 2223 | 0 |
| 2224 | 0 |
| 2225 | 0 |
| 2226 | 0 |
| 2227 | 0.001 |
| 2228 | 0.001 |
| 2229 | 0 |
| 2230 | 0.001 |
| 2231 | 0.001 |
| 2232 | 0.001 |
| 2233 | 0.001 |
| 2234 | 0.001 |
| 2235 | 0.001 |
| 2236 | 0.001 |
| 2237 | 0 |
| 2238 | 0.002 |
| 2239 | 0.001 |
| 2240 | 0.001 |
| 2241 | 0.001 |
| 2242 | 0 |
| 2243 | 0 |
| 2244 | 0 |
| 2245 | 0 |
| 2246 | 0 |
| 2247 | 0 |
| 2248 | 0 |
| 2249 | 0 |
| 2250 | 0 |
| 2251 | 0.001 |
| 2252 | 0.001 |
| 2253 | 0 |
| 2254 | 0 |
| 2255 | 0 |
| 2256 | 0.001 |
| 2257 | 0.001 |
| 2258 | 0 |
| 2259 | 0 |
| 2260 | 0.001 |
| 2261 | 0.001 |
| 2262 | 0.001 |
| 2263 | 0.001 |
| 2264 | 0.001 |
| 2265 | 0.001 |
| 2266 | 0.001 |
| 2267 | 0 |
| 2268 | 0 |
| 2269 | 0 |
| 2270 | 0 |
| 2271 | 0 |
| 2272 | 0 |
| 2273 | 0 |
| 2274 | 0 |
| 2275 | 0.001 |
| 2276 | 0.001 |
| 2277 | 0 |
| 2278 | 0.001 |
| 2279 | 0.001 |
| 2280 | 0.001 |
| 2281 | 0.002 |
| 2282 | 0.001 |
| 2283 | 0 |
| 2284 | 0.001 |
| 2285 | 0.001 |
| 2286 | 0.001 |
| 2287 | 0.001 |
| 2288 | 0.001 |
| 2289 | 0.002 |
| 2290 | 0 |
| 2291 | 0 |
| 2292 | 0 |
| 2293 | 0 |
| 2294 | 0 |
| 2295 | 0 |
| 2296 | 0 |
| 2297 | 0 |
| 2298 | 0 |
| 2299 | 0 |
| 2300 | 0.001 |
| 2301 | 0 |
| 2302 | 0 |
| 2303 | 0.001 |
| 2304 | 0 |
| 2305 | 0.001 |
| 2306 | 0.001 |
| 2307 | 0.001 |
| 2308 | 0.001 |
| 2309 | 0 |
| 2310 | 0.001 |
| 2311 | 0.001 |
| 2312 | 0.001 |
| 2313 | 0.001 |
| 2314 | 0.001 |
| 2315 | 0 |
| 2316 | 0 |
| 2317 | 0 |
| 2318 | 0 |
| 2319 | 0 |
| 2320 | 0 |
| 2321 | 0 |
| 2322 | 0 |
| 2323 | 0 |
| 2324 | 0 |
| 2325 | 0 |
| 2326 | 0.001 |
| 2327 | 0 |
| 2328 | 0.001 |
| 2329 | 0.001 |
| 2330 | 0 |
| 2331 | 0.001 |
| 2332 | 0.001 |
| 2333 | 0.001 |
| 2334 | 0.001 |
| 2335 | 0 |
| 2336 | 0.001 |
| 2337 | 0.001 |
| 2338 | 0.001 |
| 2339 | 0 |
| 2340 | 0 |
| 2341 | 0.001 |
| 2342 | 0 |
| 2343 | 0 |
| 2344 | 0 |
| 2345 | 0 |
| 2346 | 0 |
| 2347 | 0 |
| 2348 | 0 |
| 2349 | 0 |
| 2350 | 0.001 |
| 2351 | 0 |
| 2352 | 0.001 |
| 2353 | 0.001 |
| 2354 | 0 |
| 2355 | 0.001 |
| 2356 | 0.001 |
| 2357 | 0.001 |
| 2358 | 0.001 |
| 2359 | 0.001 |
| 2360 | 0.001 |
| 2361 | 0.001 |
| 2362 | 0.001 |
| 2363 | 0.001 |
| 2364 | 0 |
| 2365 | 0 |
| 2366 | 0.001 |
| 2367 | 0 |
| 2368 | 0 |
| 2369 | 0 |
| 2370 | 0.001 |
| 2371 | 0.001 |
| 2372 | 0 |
| 2373 | 0 |
| 2374 | 0 |
| 2375 | 0 |
| 2376 | 0.001 |
| 2377 | 0.001 |
| 2378 | 0 |
| 2379 | 0.001 |
| 2380 | 0 |
| 2381 | 0 |
| 2382 | 0.001 |
| 2383 | 0.001 |
| 2384 | 0.001 |
| 2385 | 0.001 |
| 2386 | 0.001 |
| 2387 | 0.001 |
| 2388 | 0 |
| 2389 | 0 |
| 2390 | 0 |
| 2391 | 0.001 |
| 2392 | 0 |
| 2393 | 0 |
| 2394 | 0 |
| 2395 | 0 |
| 2396 | 0.002 |
| 2397 | 0 |
| 2398 | 0 |
| 2399 | 0 |
| 2400 | 0 |
| 2401 | 0.001 |
| 2402 | 0 |
| 2403 | 0 |
| 2404 | 0 |
| 2405 | 0 |
| 2406 | 0.001 |
| 2407 | 0.001 |
| 2408 | 0 |
| 2409 | 0.001 |
| 2410 | 0.001 |
| 2411 | 0.001 |
| 2412 | 0 |
| 2413 | 0 |
| 2414 | 0 |
| 2415 | 0 |
| 2416 | 0 |
| 2417 | 0 |
| 2418 | 0 |
| 2419 | 0 |
| 2420 | 0 |
| 2421 | 0.001 |
| 2422 | 0.001 |
| 2423 | 0 |
| 2424 | 0 |
| 2425 | 0 |
| 2426 | 0.001 |
| 2427 | 0 |
| 2428 | 0 |
| 2429 | 0 |
| 2430 | 0 |
| 2431 | 0 |
| 2432 | 0.001 |
| 2433 | 0 |
| 2434 | 0.001 |
| 2435 | 0 |
| 2436 | 0.001 |
| 2437 | 0.001 |
| 2438 | 0 |
| 2439 | 0 |
| 2440 | 0 |
| 2441 | 0 |
| 2442 | 0.001 |
| 2443 | 0 |
| 2444 | 0 |
| 2445 | 0 |
| 2446 | 0 |
| 2447 | 0.001 |
| 2448 | 0 |
| 2449 | 0 |
| 2450 | 0 |
| 2451 | 0.001 |
| 2452 | 0 |
| 2453 | 0 |
| 2454 | 0 |
| 2455 | 0 |
| 2456 | 0 |
| 2457 | 0.001 |
| 2458 | 0 |
| 2459 | 0 |
| 2460 | 0.001 |
| 2461 | 0.001 |
| 2462 | 0 |
| 2463 | 0 |
| 2464 | 0 |
| 2465 | 0 |
| 2466 | 0 |
| 2467 | 0.001 |
| 2468 | 0.001 |
| 2469 | 0 |
| 2470 | 0 |
| 2471 | 0 |
| 2472 | 0 |
| 2473 | 0.001 |
| 2474 | 0 |
| 2475 | 0 |
| 2476 | 0.001 |
| 2477 | 0 |
| 2478 | 0 |
| 2479 | 0 |
| 2480 | 0 |
| 2481 | 0 |
| 2482 | 0.001 |
| 2483 | 0 |
| 2484 | 0 |
| 2485 | 0 |
| 2486 | 0.001 |
| 2487 | 0 |
| 2488 | 0 |
| 2489 | 0 |
| 2490 | 0 |
| 2491 | 0 |
| 2492 | 0 |
| 2493 | 0.001 |
| 2494 | 0 |
| 2495 | 0 |
| 2496 | 0 |
| 2497 | 0 |
| 2498 | 0 |
| 2499 | 0 |
| 2500 | 0 |
| 2501 | 0 |
| 2502 | 0 |
| 2503 | 0 |
| 2504 | 0 |
| 2505 | 0 |
| 2506 | 0 |
| 2507 | 0.001 |
| 2508 | 0 |
| 2509 | 0 |
| 2510 | 0 |
| 2511 | 0 |
| 2512 | 0 |
| 2513 | 0 |
| 2514 | 0 |
| 2515 | 0 |
| 2516 | 0 |
| 2517 | 0.001 |
| 2518 | 0 |
| 2519 | 0 |
| 2520 | 0 |
| 2521 | 0 |
| 2522 | 0 |
| 2523 | 0 |
| 2524 | 0 |
| 2525 | 0.001 |
| 2526 | 0 |
| 2527 | 0.001 |
| 2528 | 0 |
| 2529 | 0 |
| 2530 | 0 |
| 2531 | 0 |
| 2532 | 0 |
| 2533 | 0 |
| 2534 | 0 |
| 2535 | 0 |
| 2536 | 0 |
| 2537 | 0 |
| 2538 | 0 |
| 2539 | 0 |
| 2540 | 0 |
| 2541 | 0 |
| 2542 | 0 |
| 2543 | 0 |
| 2544 | 0.001 |
| 2545 | 0 |
| 2546 | 0 |
| 2547 | 0 |
| 2548 | 0 |
| 2549 | 0 |
| 2550 | 0 |
| 2551 | 0 |
| 2552 | 0 |
| 2553 | 0 |
| 2554 | 0 |
| 2555 | 0 |
| 2556 | 0 |
| 2557 | 0 |
| 2558 | 0 |
| 2559 | 0 |
| 2560 | 0 |
| 2561 | 0 |
| 2562 | 0 |
| 2563 | 0 |
| 2564 | 0.001 |
| 2565 | 0 |
| 2566 | 0 |
| 2567 | 0 |
| 2568 | 0 |
| 2569 | 0 |
| 2570 | 0.001 |
| 2571 | 0.001 |
| 2572 | 0 |
| 2573 | 0 |
| 2574 | 0 |
| 2575 | 0 |
| 2576 | 0.001 |
| 2577 | 0 |
| 2578 | 0 |
| 2579 | 0 |
| 2580 | 0 |
| 2581 | 0 |
| 2582 | 0 |
| 2583 | 0 |
| 2584 | 0 |
| 2585 | 0 |
| 2586 | 0 |
| 2587 | 0 |
| 2588 | 0 |
| 2589 | 0 |
| 2590 | 0 |
| 2591 | 0 |
| 2592 | 0 |
| 2593 | 0 |
| 2594 | 0 |
| 2595 | 0 |
| 2596 | 0 |
| 2597 | 0 |
| 2598 | 0.001 |
| 2599 | 0 |
| 2600 | 0 |
| 2601 | 0 |
| 2602 | 0 |
| 2603 | 0 |
| 2604 | 0 |
| 2605 | 0 |
| 2606 | 0 |
| 2607 | 0 |
| 2608 | 0 |
| 2609 | 0 |
| 2610 | 0 |
| 2611 | 0 |
| 2612 | 0 |
| 2613 | 0 |
| 2614 | 0 |
| 2615 | 0 |
| 2616 | 0 |
| 2617 | 0 |
| 2618 | 0 |
| 2619 | 0 |
| 2620 | 0 |
| 2621 | 0 |
| 2622 | 0 |
| 2623 | 0 |
| 2624 | 0 |
| 2625 | 0.001 |
| 2626 | 0 |
| 2627 | 0 |
| 2628 | 0 |
| 2629 | 0 |
| 2630 | 0 |
| 2631 | 0 |
| 2632 | 0 |
| 2633 | 0 |
| 2634 | 0 |
| 2635 | 0 |
| 2636 | 0 |
| 2637 | 0 |
| 2638 | 0 |
| 2639 | 0 |
| 2640 | 0 |
| 2641 | 0 |
| 2642 | 0 |
| 2643 | 0 |
| 2644 | 0 |
| 2645 | 0 |
| 2646 | 0 |
| 2647 | 0 |
| 2648 | 0 |
| 2649 | 0 |
| 2650 | 0 |
| 2651 | 0 |
| 2652 | 0 |
| 2653 | 0.001 |
| 2654 | 0 |
| 2655 | 0 |
| 2656 | 0 |
| 2657 | 0 |
| 2658 | 0 |
| 2659 | 0 |
| 2660 | 0 |
| 2661 | 0 |
| 2662 | 0 |
| 2663 | 0 |
| 2664 | 0 |
| 2665 | 0 |
| 2666 | 0 |
| 2667 | 0 |
| 2668 | 0 |
| 2669 | 0 |
| 2670 | 0 |
| 2671 | 0 |
| 2672 | 0 |
| 2673 | 0 |
| 2674 | 0 |
| 2675 | 0 |
| 2676 | 0 |
| 2677 | 0 |
| 2678 | 0.001 |
| 2679 | 0 |
| 2680 | 0 |
| 2681 | 0 |
| 2682 | 0 |
| 2683 | 0 |
| 2684 | 0 |
| 2685 | 0 |
| 2686 | 0 |
| 2687 | 0 |
| 2688 | 0 |
| 2689 | 0 |
| 2690 | 0 |
| 2691 | 0 |
| 2692 | 0 |
| 2693 | 0 |
| 2694 | 0 |
| 2695 | 0 |
| 2696 | 0 |
| 2697 | 0 |
| 2698 | 0 |
| 2699 | 0 |
| 2700 | 0 |
| 2701 | 0 |
| 2702 | 0 |
| 2703 | 0 |
| 2704 | 0 |
| 2705 | 0 |
| 2706 | 0 |
| 2707 | 0 |
| 2708 | 0 |
| 2709 | 0 |
| 2710 | 0 |
| 2711 | 0 |
| 2712 | 0 |
| 2713 | 0 |
| 2714 | 0 |
| 2715 | 0 |
| 2716 | 0 |
| 2717 | 0 |
| 2718 | 0 |
| 2719 | 0 |
| 2720 | 0 |
| 2721 | 0 |
| 2722 | 0 |
| 2723 | 0 |
| 2724 | 0 |
| 2725 | 0 |
| 2726 | 0 |
| 2727 | 0 |
| 2728 | 0 |
| 2729 | 0 |
| 2730 | 0 |
| 2731 | 0 |
| 2732 | 0 |
| 2733 | 0 |
| 2734 | 0 |
| 2735 | 0.001 |
| 2736 | 0 |
| 2737 | 0 |
| 2738 | 0 |
| 2739 | 0 |
| 2740 | 0 |
| 2741 | 0 |
| 2742 | 0 |
| 2743 | 0 |
| 2744 | 0 |
| 2745 | 0 |
| 2746 | 0 |
| 2747 | 0 |
| 2748 | 0 |
| 2749 | 0 |
| 2750 | 0 |
| 2751 | 0 |
| 2752 | 0 |
| 2753 | 0 |
| 2754 | 0 |
| 2755 | 0 |
| 2756 | 0 |
| 2757 | 0 |
| 2758 | 0 |
| 2759 | 0 |
| 2760 | 0 |
| 2761 | 0 |
| 2762 | 0 |
| 2763 | 0 |
| 2764 | 0 |
| 2765 | 0 |
| 2766 | 0 |
| 2767 | 0 |
| 2768 | 0 |
| 2769 | 0 |
| 2770 | 0 |
| 2771 | 0 |
| 2772 | 0 |
| 2773 | 0 |
| 2774 | 0 |
| 2775 | 0 |
| 2776 | 0 |
| 2777 | 0 |
| 2778 | 0 |
| 2779 | 0 |
| 2780 | 0 |
| 2781 | 0 |
| 2782 | 0 |
| 2783 | 0 |
| 2784 | 0 |
| 2785 | 0 |
| 2786 | 0 |
| 2787 | 0 |
| 2788 | 0 |
| 2789 | 0 |
| 2790 | 0 |
| 2791 | 0 |
| 2792 | 0 |
| 2793 | 0 |
| 2794 | 0 |
| 2795 | 0 |
| 2796 | 0 |
| 2797 | 0 |
| 2798 | 0 |
| 2799 | 0 |
| 2800 | 0 |
| 2801 | 0 |
| 2802 | 0 |
| 2803 | 0 |
| 2804 | 0 |
| 2805 | 0 |
| 2806 | 0 |
| 2807 | 0 |
| 2808 | 0 |
| 2809 | 0 |
| 2810 | 0 |
| 2811 | 0 |
| 2812 | 0 |
| 2813 | 0 |
| 2814 | 0 |
| 2815 | 0 |
| 2816 | 0 |
| 2817 | 0 |
| 2818 | 0 |
| 2819 | 0 |
| 2820 | 0 |
| 2821 | 0 |
| 2822 | 0 |
| 2823 | 0 |
| 2824 | 0 |
| 2825 | 0 |
| 2826 | 0 |
| 2827 | 0 |
| 2828 | 0 |
| 2829 | 0 |
| 2830 | 0 |
| 2831 | 0 |
| 2832 | 0 |
| 2833 | 0 |
| 2834 | 0 |
| 2835 | 0 |
| 2836 | 0 |
| 2837 | 0 |
| 2838 | 0 |
| 2839 | 0 |
| 2840 | 0 |
| 2841 | 0 |
| 2842 | 0 |
| 2843 | 0 |
| 2844 | 0 |
| 2845 | 0 |
| 2846 | 0 |
| 2847 | 0 |
| 2848 | 0 |
| 2849 | 0 |
| 2850 | 0 |
| 2851 | 0 |
| 2852 | 0 |
| 2853 | 0 |
| 2854 | 0 |
| 2855 | 0 |
| 2856 | 0 |
| 2857 | 0 |
| 2858 | 0 |
| 2859 | 0 |
| 2860 | 0 |
| 2861 | 0 |
| 2862 | 0 |
| 2863 | 0 |
| 2864 | 0 |
| 2865 | 0 |
| 2866 | 0 |
| 2867 | 0 |
| 2868 | 0 |
| 2869 | 0 |
| 2870 | 0 |
| 2871 | 0 |
| 2872 | 0 |
| 2873 | 0 |
| 2874 | 0 |
| 2875 | 0 |
| 2876 | 0 |
| 2877 | 0 |
| 2878 | 0 |
| 2879 | 0 |
| 2880 | 0 |
| 2881 | 0 |
| 2882 | 0 |
| 2883 | 0 |
| 2884 | 0 |
| 2885 | 0 |
| 2886 | 0 |
| 2887 | 0 |
| 2888 | 0 |
| 2889 | 0 |
| 2890 | 0 |
| 2891 | 0 |
| 2892 | 0 |
| 2893 | 0 |
| 2894 | 0 |
| 2895 | 0 |
| 2896 | 0 |
| 2897 | 0 |
| 2898 | 0 |
| 2899 | 0 |
| 2900 | 0 |
| 2901 | 0 |
| 2902 | 0 |
| 2903 | 0 |
| 2904 | 0 |
| 2905 | 0 |
| 2906 | 0 |
| 2907 | 0 |
| 2908 | 0 |
| 2909 | 0 |
| 2910 | 0 |
| 2911 | 0 |
| 2912 | 0 |
| 2913 | 0 |
| 2914 | 0 |
| 2915 | 0 |
| 2916 | 0 |
| 2917 | 0 |
| 2918 | 0 |
| 2919 | 0 |
| 2920 | 0 |
| 2921 | 0 |
| 2922 | 0 |
| 2923 | 0 |
| 2924 | 0 |
| 2925 | 0 |
| 2926 | 0 |
| 2927 | 0 |
| 2928 | 0 |
| 2929 | 0 |
| 2930 | 0 |
| 2931 | 0 |
| 2932 | 0 |
| 2933 | 0 |
| 2934 | 0 |
| 2935 | 0 |
| 2936 | 0 |
| 2937 | 0 |
| 2938 | 0 |
| 2939 | 0 |
| 2940 | 0 |
| 2941 | 0 |
| 2942 | 0 |
| 2943 | 0 |
| 2944 | 0 |
| 2945 | 0 |
| 2946 | 0 |
| 2947 | 0 |
| 2948 | 0 |
| 2949 | 0 |
| 2950 | 0 |
| 2951 | 0 |
| 2952 | 0 |
| 2953 | 0 |
| 2954 | 0 |
| 2955 | 0 |
| 2956 | 0 |
| 2957 | 0 |
| 2958 | 0 |
| 2959 | 0 |
| 2960 | 0 |
| 2961 | 0 |
| 2962 | 0 |
| 2963 | 0 |
| 2964 | 0 |
| 2965 | 0 |
| 2966 | 0 |
| 2967 | 0 |
| 2968 | 0 |
| 2969 | 0 |
| 2970 | 0 |
| 2971 | 0 |
| 2972 | 0 |
| 2973 | 0 |
| 2974 | 0 |
| 2975 | 0 |
| 2976 | 0 |
| 2977 | 0 |
| 2978 | 0 |
| 2979 | 0 |
| 2980 | 0 |
| 2981 | 0 |
| 2982 | 0 |
| 2983 | 0 |
| 2984 | 0 |
| 2985 | 0 |
| 2986 | 0 |
| 2987 | 0 |
| 2988 | 0 |
| 2989 | 0 |
| 2990 | 0 |
| 2991 | 0 |
| 2992 | 0 |
| 2993 | 0 |
| 2994 | 0 |
| 2995 | 0 |
| 2996 | 0 |
| 2997 | 0 |
| 2998 | 0 |
| 2999 | 0 |
| 3000 | 0 |
| 3001 | 0 |
| 3002 | 0 |
| 3003 | 0 |
| 3004 | 0 |
| 3005 | 0 |
| 3006 | 0 |
| 3007 | 0 |
| 3008 | 0 |
| 3009 | 0 |
| 3010 | 0 |
| 3011 | 0 |
| 3012 | 0 |
| 3013 | 0 |
| 3014 | 0 |
| 3015 | 0 |
| 3016 | 0 |
| 3017 | 0 |
| 3018 | 0 |
| 3019 | 0 |
| 3020 | 0 |
| 3021 | 0 |
| 3022 | 0 |
| 3023 | 0 |
| 3024 | 0 |
| 3025 | 0 |
| 3026 | 0 |
| 3027 | 0 |
| 3028 | 0 |
| 3029 | 0 |
| 3030 | 0 |
| 3031 | 0 |
| 3032 | 0 |
| 3033 | 0 |
| 3034 | 0 |
| 3035 | 0 |
| 3036 | 0 |
| 3037 | 0 |
| 3038 | 0 |
| 3039 | 0 |
| 3040 | 0 |
| 3041 | 0 |
| 3042 | 0 |
| 3043 | 0 |
| 3044 | 0 |
| 3045 | 0 |
| 3046 | 0 |
| 3047 | 0 |
| 3048 | 0 |
| 3049 | 0 |
| 3050 | 0 |
| 3051 | 0 |
| 3052 | 0 |
| 3053 | 0 |
| 3054 | 0 |
| 3055 | 0 |
| 3056 | 0 |
| 3057 | 0 |
| 3058 | 0 |
| 3059 | 0 |
| 3060 | 0 |
| 3061 | 0 |
| 3062 | 0 |
| 3063 | 0 |
| 3064 | 0 |
| 3065 | 0 |
| 3066 | 0 |
| 3067 | 0 |
| 3068 | 0 |
| 3069 | 0 |
| 3070 | 0 |
| 3071 | 0 |
| 3072 | 0 |
| 3073 | 0 |
| 3074 | 0 |
| 3075 | 0 |
| 3076 | 0 |
| 3077 | 0 |
| 3078 | 0 |
| 3079 | 0 |
| 3080 | 0 |
| 3081 | 0 |
| 3082 | 0 |
| 3083 | 0 |
| 3084 | 0 |
| 3085 | 0 |
| 3086 | 0 |
| 3087 | 0 |
| 3088 | 0 |
| 3089 | 0 |
| 3090 | 0 |
| 3091 | 0 |
| 3092 | 0 |
| 3093 | 0 |
| 3094 | 0 |
| 3095 | 0 |
| 3096 | 0 |
| 3097 | 0 |
| 3098 | 0 |
| 3099 | 0 |
| 3100 | 0 |
| 3101 | 0 |
| 3102 | 0 |
| 3103 | 0 |
| 3104 | 0 |
| 3105 | 0 |
| 3106 | 0 |
| 3107 | 0 |
| 3108 | 0 |
| 3109 | 0 |
| 3110 | 0 |
| 3111 | 0 |
| 3112 | 0 |
| 3113 | 0 |
| 3114 | 0 |
| 3115 | 0 |
| 3116 | 0 |
| 3117 | 0 |
| 3118 | 0 |
| 3119 | 0 |
| 3120 | 0 |
| 3121 | 0 |
| 3122 | 0 |
| 3123 | 0 |
| 3124 | 0 |
| 3125 | 0 |
| 3126 | 0 |
| 3127 | 0 |
| 3128 | 0 |
| 3129 | 0 |
| 3130 | 0 |
| 3131 | 0 |
| 3132 | 0 |
| 3133 | 0 |
| 3134 | 0 |
| 3135 | 0 |
| 3136 | 0 |
| 3137 | 0 |
| 3138 | 0 |
| 3139 | 0 |
| 3140 | 0 |
| 3141 | 0 |
| 3142 | 0 |
| 3143 | 0 |
| 3144 | 0 |
| 3145 | 0 |
| 3146 | 0 |
| 3147 | 0 |
| 3148 | 0 |
| 3149 | 0 |
| 3150 | 0 |
| 3151 | 0 |
| 3152 | 0 |
| 3153 | 0 |
| 3154 | 0 |
| 3155 | 0 |
| 3156 | 0 |
| 3157 | 0 |
| 3158 | 0 |
| 3159 | 0 |
| 3160 | 0 |
| 3161 | 0 |
| 3162 | 0 |
| 3163 | 0 |
| 3164 | 0 |
| 3165 | 0 |
| 3166 | 0 |
| 3167 | 0 |
| 3168 | 0 |
| 3169 | 0 |
| 3170 | 0 |
| 3171 | 0 |
| 3172 | 0 |
| 3173 | 0 |
| 3174 | 0 |
| 3175 | 0 |
| 3176 | 0 |
| 3177 | 0 |
| 3178 | 0 |
| 3179 | 0 |
| 3180 | 0 |
| 3181 | 0 |
| 3182 | 0 |
| 3183 | 0 |
| 3184 | 0 |
| 3185 | 0 |
| 3186 | 0 |
| 3187 | 0 |
| 3188 | 0 |
| 3189 | 0 |
| 3190 | 0 |
| 3191 | 0 |
| 3192 | 0 |
| 3193 | 0 |
| 3194 | 0 |
| 3195 | 0 |
| 3196 | 0 |
| 3197 | 0 |
| 3198 | 0 |
| 3199 | 0 |
| 3200 | 0 |
| 3201 | 0 |
| 3202 | 0 |
| 3203 | 0 |
| 3204 | 0 |
| 3205 | 0 |
| 3206 | 0 |
| 3207 | 0 |
| 3208 | 0 |
| 3209 | 0 |
| 3210 | 0 |
| 3211 | 0 |
| 3212 | 0 |
| 3213 | 0 |
| 3214 | 0 |
| 3215 | 0 |
| 3216 | 0 |
| 3217 | 0 |
| 3218 | 0 |
| 3219 | 0 |
| 3220 | 0 |
| 3221 | 0 |
| 3222 | 0 |
| 3223 | 0 |
| 3224 | 0 |
| 3225 | 0 |
| 3226 | 0 |
| 3227 | 0 |
| 3228 | 0 |
| 3229 | 0 |
| 3230 | 0 |
| 3231 | 0 |
| 3232 | 0 |
| 3233 | 0 |
| 3234 | 0 |
| 3235 | 0 |
| 3236 | 0 |
| 3237 | 0 |
| 3238 | 0 |
| 3239 | 0 |
| 3240 | 0 |
| 3241 | 0 |
| 3242 | 0 |
| 3243 | 0 |
| 3244 | 0 |
| 3245 | 0 |
| 3246 | 0 |
| 3247 | 0 |
| 3248 | 0 |
| 3249 | 0 |
| 3250 | 0 |
| 3251 | 0 |
| 3252 | 0 |
| 3253 | 0 |
| 3254 | 0 |
| 3255 | 0 |
| 3256 | 0 |
| 3257 | 0 |
| 3258 | 0 |
| 3259 | 0 |
| 3260 | 0 |
| 3261 | 0 |
| 3262 | 0 |
| 3263 | 0 |
| 3264 | 0 |
| 3265 | 0 |
| 3266 | 0 |
| 3267 | 0 |
| 3268 | 0 |
| 3269 | 0 |
| 3270 | 0 |
| 3271 | 0 |
| 3272 | 0 |
| 3273 | 0 |
| 3274 | 0 |
| 3275 | 0 |
| 3276 | 0 |
| 3277 | 0 |
| 3278 | 0 |
| 3279 | 0 |
| 3280 | 0 |
| 3281 | 0 |
| 3282 | 0 |
| 3283 | 0 |
| 3284 | 0 |
| 3285 | 0 |
| 3286 | 0 |
| 3287 | 0 |
| 3288 | 0 |
| 3289 | 0 |
| 3290 | 0 |
| 3291 | 0 |
| 3292 | 0 |
| 3293 | 0 |
| 3294 | 0 |
| 3295 | 0 |
| 3296 | 0 |
| 3297 | 0 |
| 3298 | 0 |
| 3299 | 0 |
| 3300 | 0 |
| 3301 | 0 |
| 3302 | 0 |
| 3303 | 0 |
| 3304 | 0 |
| 3305 | 0 |
| 3306 | 0 |
| 3307 | 0 |
| 3308 | 0 |
| 3309 | 0 |
| 3310 | 0 |
| 3311 | 0 |
| 3312 | 0 |
| 3313 | 0 |
| 3314 | 0 |
| 3315 | 0 |
| 3316 | 0 |
| 3317 | 0 |
| 3318 | 0 |
| 3319 | 0 |
| 3320 | 0 |
| 3321 | 0 |
| 3322 | 0 |
| 3323 | 0 |
| 3324 | 0 |
| 3325 | 0 |
| 3326 | 0 |
| 3327 | 0 |
| 3328 | 0 |
| 3329 | 0 |
| 3330 | 0 |
| 3331 | 0 |
| 3332 | 0 |
| 3333 | 0 |
| 3334 | 0 |
| 3335 | 0 |
| 3336 | 0 |
| 3337 | 0 |
| 3338 | 0 |
| 3339 | 0 |
| 3340 | 0 |
| 3341 | 0 |
| 3342 | 0 |
| 3343 | 0 |
| 3344 | 0 |
| 3345 | 0 |
| 3346 | 0 |
| 3347 | 0 |
| 3348 | 0 |
| 3349 | 0 |
| 3350 | 0 |
| 3351 | 0 |
| 3352 | 0 |
| 3353 | 0 |
| 3354 | 0 |
| 3355 | 0 |
| 3356 | 0 |
| 3357 | 0 |
| 3358 | 0 |
| 3359 | 0 |
| 3360 | 0 |
| 3361 | 0 |
| 3362 | 0 |
| 3363 | 0 |
| 3364 | 0 |
| 3365 | 0 |
| 3366 | 0 |
| 3367 | 0 |
| 3368 | 0 |
| 3369 | 0 |
| 3370 | 0 |
| 3371 | 0 |
| 3372 | 0 |
| 3373 | 0 |
| 3374 | 0 |
| 3375 | 0 |
| 3376 | 0 |
| 3377 | 0 |
| 3378 | 0 |
| 3379 | 0 |
| 3380 | 0 |
| 3381 | 0 |
| 3382 | 0 |
| 3383 | 0 |
| 3384 | 0 |
| 3385 | 0 |
| 3386 | 0 |
| 3387 | 0 |
| 3388 | 0 |
| 3389 | 0 |
| 3390 | 0 |
| 3391 | 0 |
| 3392 | 0 |
| 3393 | 0 |
| 3394 | 0 |
| 3395 | 0 |
| 3396 | 0 |
| 3397 | 0 |
| 3398 | 0 |
| 3399 | 0 |
| 3400 | 0 |
| 3401 | 0 |
| 3402 | 0 |
| 3403 | 0 |
| 3404 | 0 |